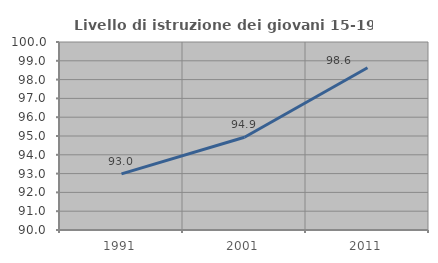
| Category | Livello di istruzione dei giovani 15-19 anni |
|---|---|
| 1991.0 | 92.982 |
| 2001.0 | 94.937 |
| 2011.0 | 98.63 |